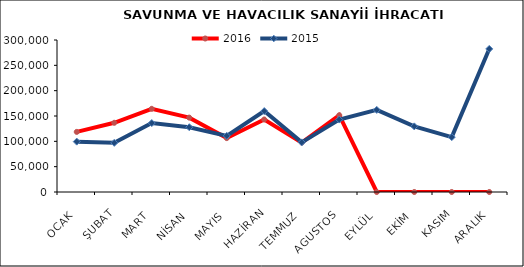
| Category | 2016 | 2015 |
|---|---|---|
| OCAK | 118636.142 | 99405.477 |
| ŞUBAT | 136586.825 | 97020.905 |
| MART | 164167.688 | 136118.544 |
| NİSAN | 146799.343 | 127832.475 |
| MAYIS | 106367.895 | 110824.957 |
| HAZİRAN | 143121.239 | 159703.815 |
| TEMMUZ | 97525.394 | 97948.048 |
| AGUSTOS | 151570.553 | 142957.123 |
| EYLÜL | 0 | 162035.996 |
| EKİM | 0 | 129552.536 |
| KASIM | 0 | 108305.565 |
| ARALIK | 0 | 282382.476 |